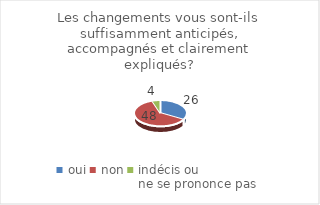
| Category | Les changements vous sont-ils suffisamment anticipés, accompagnés et clairement expliqués? |
|---|---|
| oui | 26 |
| non | 48 |
| indécis ou 
ne se prononce pas | 4 |